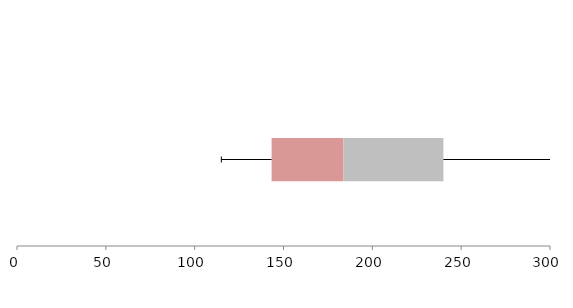
| Category | Series 1 | Series 2 | Series 3 |
|---|---|---|---|
| 0 | 143.301 | 40.423 | 56.276 |